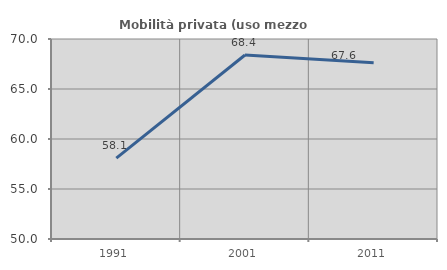
| Category | Mobilità privata (uso mezzo privato) |
|---|---|
| 1991.0 | 58.089 |
| 2001.0 | 68.4 |
| 2011.0 | 67.618 |